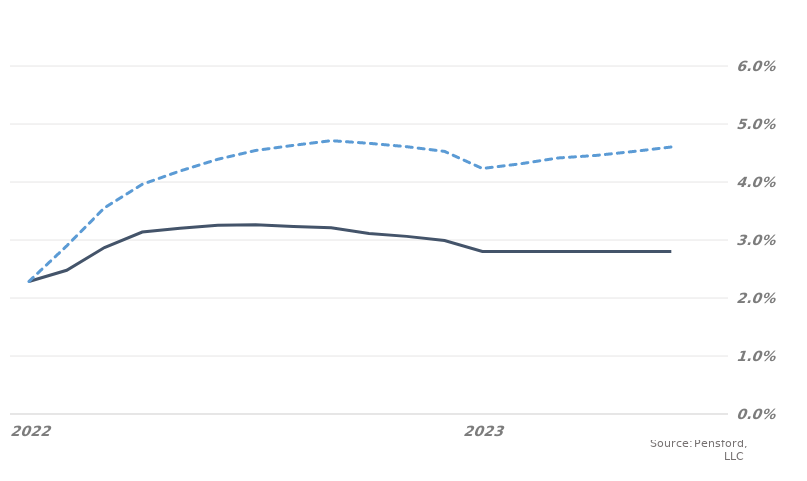
| Category | MARKET EXPECTATIONS | +1 Standard Deviation |
|---|---|---|
| 2022-07-29 | 0.023 | 0.023 |
| 2022-08-29 | 0.025 | 0.029 |
| 2022-09-29 | 0.029 | 0.036 |
| 2022-10-29 | 0.031 | 0.04 |
| 2022-11-29 | 0.032 | 0.042 |
| 2022-12-29 | 0.033 | 0.044 |
| 2023-01-29 | 0.033 | 0.045 |
| 2023-02-28 | 0.032 | 0.046 |
| 2023-03-28 | 0.032 | 0.047 |
| 2023-04-28 | 0.031 | 0.047 |
| 2023-05-28 | 0.031 | 0.046 |
| 2023-06-28 | 0.03 | 0.045 |
| 2023-07-28 | 0.028 | 0.042 |
| 2023-08-28 | 0.028 | 0.043 |
| 2023-09-28 | 0.028 | 0.044 |
| 2023-10-28 | 0.028 | 0.045 |
| 2023-11-28 | 0.028 | 0.045 |
| 2023-12-28 | 0.028 | 0.046 |
| 2024-01-28 | 0.026 | 0.042 |
| 2024-02-28 | 0.025 | 0.042 |
| 2024-03-28 | 0.025 | 0.044 |
| 2024-04-28 | 0.025 | 0.044 |
| 2024-05-28 | 0.025 | 0.045 |
| 2024-06-28 | 0.025 | 0.046 |
| 2024-07-28 | 0.023 | 0.043 |
| 2024-08-28 | 0.022 | 0.042 |
| 2024-09-28 | 0.022 | 0.043 |
| 2024-10-28 | 0.022 | 0.043 |
| 2024-11-28 | 0.022 | 0.044 |
| 2024-12-28 | 0.022 | 0.044 |
| 2025-01-28 | 0.022 | 0.044 |
| 2025-02-28 | 0.022 | 0.045 |
| 2025-03-28 | 0.022 | 0.045 |
| 2025-04-28 | 0.022 | 0.046 |
| 2025-05-28 | 0.022 | 0.044 |
| 2025-06-28 | 0.022 | 0.043 |
| 2025-07-28 | 0.022 | 0.042 |
| 2025-08-28 | 0.021 | 0.041 |
| 2025-09-28 | 0.021 | 0.042 |
| 2025-10-28 | 0.021 | 0.042 |
| 2025-11-28 | 0.021 | 0.042 |
| 2025-12-28 | 0.021 | 0.043 |
| 2026-01-28 | 0.021 | 0.043 |
| 2026-02-28 | 0.021 | 0.043 |
| 2026-03-28 | 0.021 | 0.043 |
| 2026-04-28 | 0.021 | 0.044 |
| 2026-05-28 | 0.021 | 0.044 |
| 2026-06-28 | 0.021 | 0.044 |
| 2026-07-28 | 0.022 | 0.045 |
| 2026-08-28 | 0.022 | 0.045 |
| 2026-09-28 | 0.022 | 0.045 |
| 2026-10-28 | 0.022 | 0.046 |
| 2026-11-28 | 0.022 | 0.046 |
| 2026-12-28 | 0.022 | 0.046 |
| 2027-01-28 | 0.022 | 0.046 |
| 2027-02-28 | 0.022 | 0.047 |
| 2027-03-28 | 0.022 | 0.047 |
| 2027-04-28 | 0.022 | 0.047 |
| 2027-05-28 | 0.022 | 0.047 |
| 2027-06-28 | 0.022 | 0.046 |
| 2027-07-28 | 0.023 | 0.047 |
| 2027-08-28 | 0.023 | 0.047 |
| 2027-09-28 | 0.023 | 0.048 |
| 2027-10-28 | 0.023 | 0.048 |
| 2027-11-28 | 0.023 | 0.048 |
| 2027-12-28 | 0.023 | 0.048 |
| 2028-01-28 | 0.023 | 0.048 |
| 2028-02-28 | 0.023 | 0.049 |
| 2028-03-28 | 0.023 | 0.049 |
| 2028-04-28 | 0.023 | 0.049 |
| 2028-05-28 | 0.023 | 0.051 |
| 2028-06-28 | 0.023 | 0.052 |
| 2028-07-28 | 0.024 | 0.054 |
| 2028-08-28 | 0.024 | 0.055 |
| 2028-09-28 | 0.024 | 0.055 |
| 2028-10-28 | 0.024 | 0.055 |
| 2028-11-28 | 0.024 | 0.056 |
| 2028-12-28 | 0.024 | 0.056 |
| 2029-01-28 | 0.024 | 0.056 |
| 2029-02-28 | 0.024 | 0.056 |
| 2029-03-28 | 0.024 | 0.056 |
| 2029-04-28 | 0.024 | 0.057 |
| 2029-05-28 | 0.024 | 0.055 |
| 2029-06-28 | 0.024 | 0.053 |
| 2029-07-28 | 0.024 | 0.052 |
| 2029-08-28 | 0.024 | 0.053 |
| 2029-09-28 | 0.024 | 0.053 |
| 2029-10-28 | 0.024 | 0.053 |
| 2029-11-28 | 0.024 | 0.053 |
| 2029-12-28 | 0.024 | 0.054 |
| 2030-01-28 | 0.024 | 0.054 |
| 2030-02-28 | 0.024 | 0.054 |
| 2030-03-28 | 0.024 | 0.054 |
| 2030-04-28 | 0.024 | 0.054 |
| 2030-05-28 | 0.024 | 0.053 |
| 2030-06-28 | 0.024 | 0.052 |
| 2030-07-28 | 0.025 | 0.052 |
| 2030-08-28 | 0.025 | 0.053 |
| 2030-09-28 | 0.025 | 0.053 |
| 2030-10-28 | 0.025 | 0.053 |
| 2030-11-28 | 0.025 | 0.054 |
| 2030-12-28 | 0.025 | 0.054 |
| 2031-01-28 | 0.025 | 0.054 |
| 2031-02-28 | 0.025 | 0.054 |
| 2031-03-28 | 0.025 | 0.054 |
| 2031-04-28 | 0.025 | 0.054 |
| 2031-05-28 | 0.025 | 0.054 |
| 2031-06-28 | 0.025 | 0.053 |
| 2031-07-28 | 0.026 | 0.054 |
| 2031-08-28 | 0.027 | 0.055 |
| 2031-09-28 | 0.027 | 0.055 |
| 2031-10-28 | 0.027 | 0.055 |
| 2031-11-28 | 0.027 | 0.055 |
| 2031-12-28 | 0.027 | 0.055 |
| 2032-01-28 | 0.027 | 0.055 |
| 2032-02-28 | 0.027 | 0.056 |
| 2032-03-28 | 0.027 | 0.056 |
| 2032-04-28 | 0.027 | 0.056 |
| 2032-05-28 | 0.027 | 0.056 |
| 2032-06-28 | 0.027 | 0.056 |